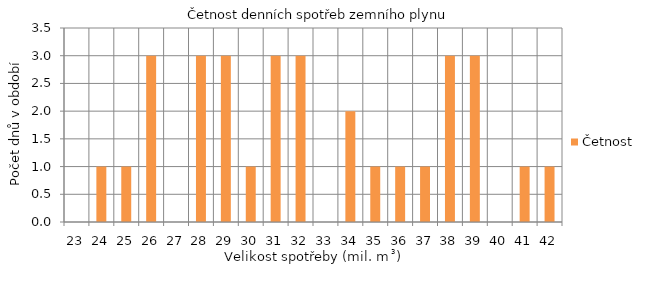
| Category | Četnost |
|---|---|
| 23.0 | 0 |
| 24.0 | 1 |
| 25.0 | 1 |
| 26.0 | 3 |
| 27.0 | 0 |
| 28.0 | 3 |
| 29.0 | 3 |
| 30.0 | 1 |
| 31.0 | 3 |
| 32.0 | 3 |
| 33.0 | 0 |
| 34.0 | 2 |
| 35.0 | 1 |
| 36.0 | 1 |
| 37.0 | 1 |
| 38.0 | 3 |
| 39.0 | 3 |
| 40.0 | 0 |
| 41.0 | 1 |
| 42.0 | 1 |